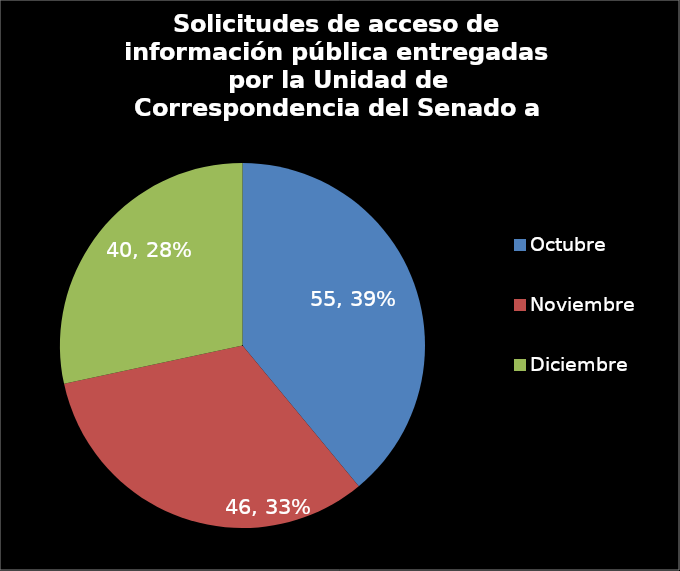
| Category | Series 0 |
|---|---|
| Octubre | 55 |
| Noviembre | 46 |
| Diciembre | 40 |